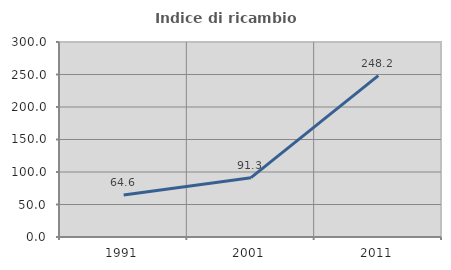
| Category | Indice di ricambio occupazionale  |
|---|---|
| 1991.0 | 64.593 |
| 2001.0 | 91.324 |
| 2011.0 | 248.214 |